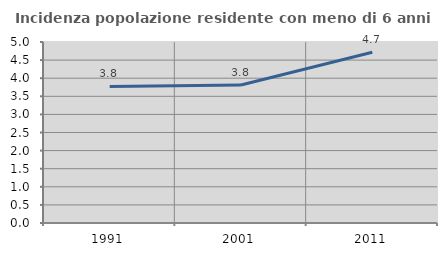
| Category | Incidenza popolazione residente con meno di 6 anni |
|---|---|
| 1991.0 | 3.771 |
| 2001.0 | 3.81 |
| 2011.0 | 4.716 |